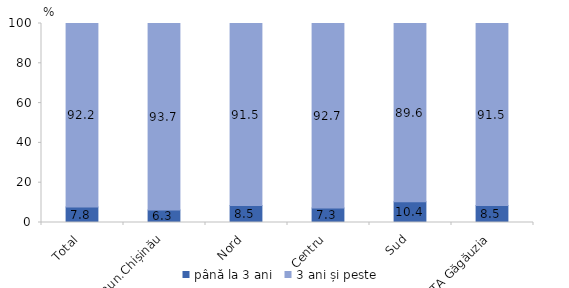
| Category | până la 3 ani | 3 ani și peste |
|---|---|---|
| Total | 7.8 | 92.2 |
| mun.Chișinău | 6.3 | 93.7 |
| Nord | 8.5 | 91.5 |
| Centru | 7.3 | 92.7 |
| Sud | 10.4 | 89.6 |
| UTA Găgăuzia | 8.5 | 91.5 |